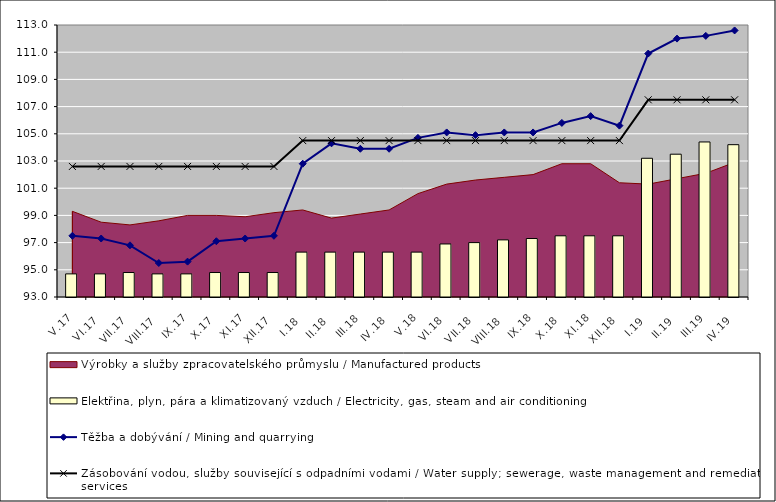
| Category | Elektřina, plyn, pára a klimatizovaný vzduch / Electricity, gas, steam and air conditioning |
|---|---|
| V.17 | 94.7 |
| VI.17 | 94.7 |
| VII.17 | 94.8 |
| VIII.17 | 94.7 |
| IX.17 | 94.7 |
| X.17 | 94.8 |
| XI.17 | 94.8 |
| XII.17 | 94.8 |
| I.18 | 96.3 |
| II.18 | 96.3 |
| III.18 | 96.3 |
| IV.18 | 96.3 |
| V.18 | 96.3 |
| VI.18 | 96.9 |
| VII.18 | 97 |
| VIII.18 | 97.2 |
| IX.18 | 97.3 |
| X.18 | 97.5 |
| XI.18 | 97.5 |
| XII.18 | 97.5 |
| I.19 | 103.2 |
| II.19 | 103.5 |
| III.19 | 104.4 |
| IV.19 | 104.2 |